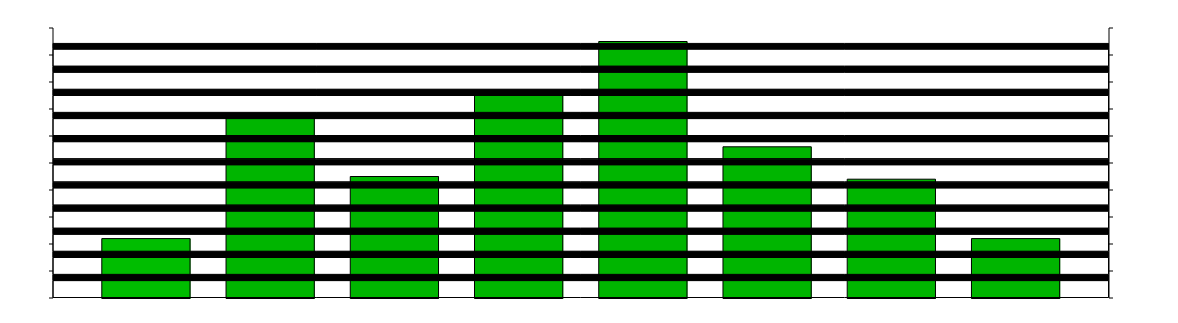
| Category | Series 0 | Series 3 | Projekt 3 | Projekt 4 | Projekt 5 | Projekt 6 | Projekt 7 | Projekt 8 |
|---|---|---|---|---|---|---|---|---|
| 0 | 0.22 | 0.667 | 0.45 | 0.75 | 0.95 | 0.56 | 0.44 | 0.22 |